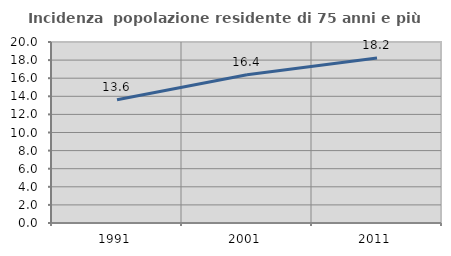
| Category | Incidenza  popolazione residente di 75 anni e più |
|---|---|
| 1991.0 | 13.621 |
| 2001.0 | 16.387 |
| 2011.0 | 18.222 |